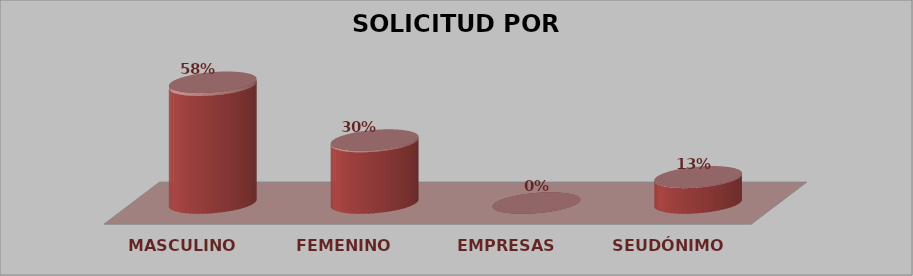
| Category | SOLICITUD POR GÉNERO | Series 1 |
|---|---|---|
| MASCULINO | 23 | 0.575 |
| FEMENINO | 12 | 0.3 |
| EMPRESAS | 0 | 0 |
| SEUDÓNIMO | 5 | 0.125 |